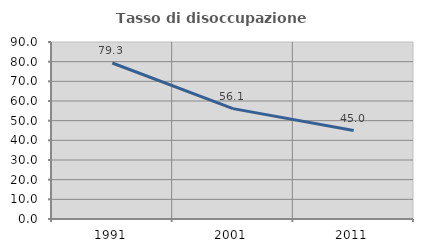
| Category | Tasso di disoccupazione giovanile  |
|---|---|
| 1991.0 | 79.31 |
| 2001.0 | 56.115 |
| 2011.0 | 45 |